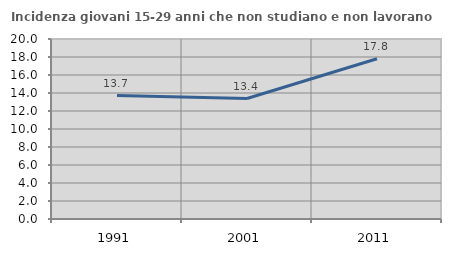
| Category | Incidenza giovani 15-29 anni che non studiano e non lavorano  |
|---|---|
| 1991.0 | 13.709 |
| 2001.0 | 13.386 |
| 2011.0 | 17.81 |